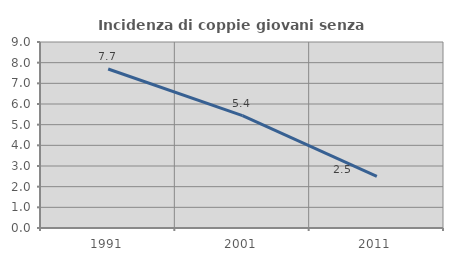
| Category | Incidenza di coppie giovani senza figli |
|---|---|
| 1991.0 | 7.692 |
| 2001.0 | 5.439 |
| 2011.0 | 2.498 |